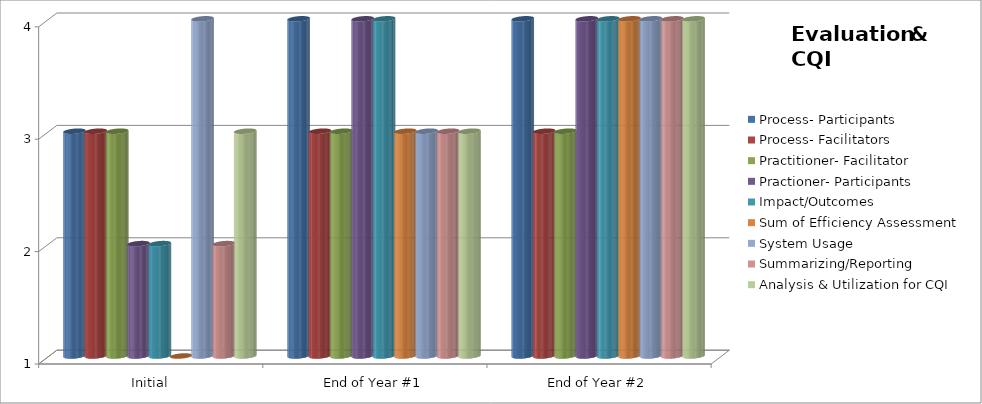
| Category | Process- Participants  | Process- Facilitators | Practitioner- Facilitator  | Practioner- Participants | Impact/Outcomes  | Sum of Efficiency Assessment  | System Usage  | Summarizing/Reporting | Analysis & Utilization for CQI |
|---|---|---|---|---|---|---|---|---|---|
| Initial | 3 | 3 | 3 | 2 | 2 | 1 | 4 | 2 | 3 |
| End of Year #1 | 4 | 3 | 3 | 4 | 4 | 3 | 3 | 3 | 3 |
| End of Year #2 | 4 | 3 | 3 | 4 | 4 | 4 | 4 | 4 | 4 |